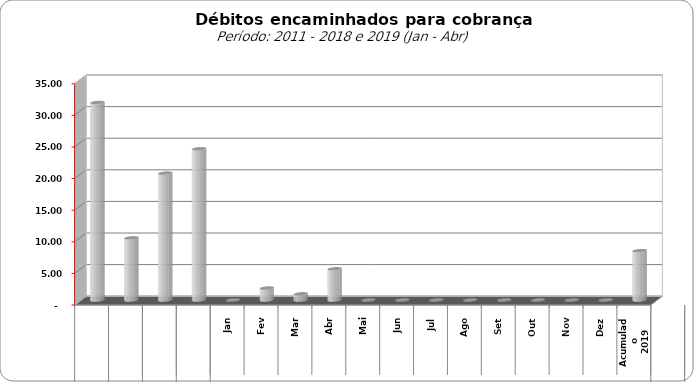
| Category |  3.309.443,02   3.859.728,44   11.181.928,25   7.600.526,01   31.248.623,50   9.830.198,34   20.083.556,95   23.931.734,08   -     1.897.202,11   974.309,37   4.937.737,42   -     -     -     -     -     -     -     -     7.809.248,90  |
|---|---|
| 0 | 31248623.5 |
| 1 | 9830198.34 |
| 2 | 20083556.95 |
| 3 | 23931734.08 |
| 4 | 0 |
| 5 | 1897202.11 |
| 6 | 974309.37 |
| 7 | 4937737.42 |
| 8 | 0 |
| 9 | 0 |
| 10 | 0 |
| 11 | 0 |
| 12 | 0 |
| 13 | 0 |
| 14 | 0 |
| 15 | 0 |
| 16 | 7809248.9 |